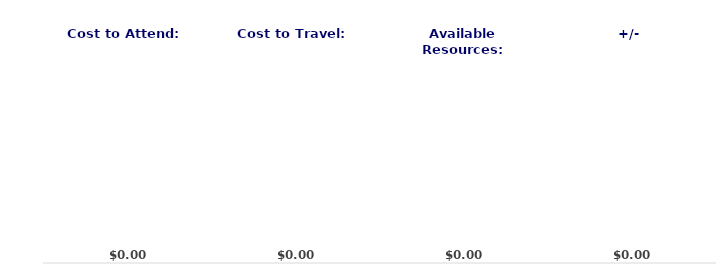
| Category | Series 0 |
|---|---|
| Cost to Attend: | 0 |
| Cost to Travel: | 0 |
| Available Resources: | 0 |
| +/- | 0 |